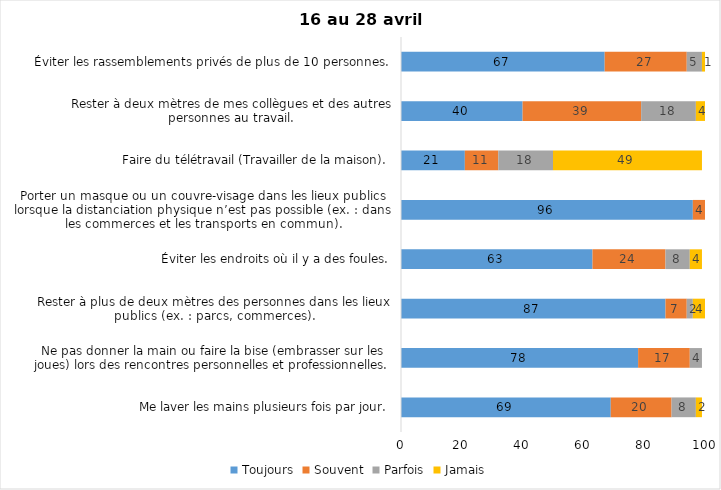
| Category | Toujours | Souvent | Parfois | Jamais |
|---|---|---|---|---|
| Me laver les mains plusieurs fois par jour. | 69 | 20 | 8 | 2 |
| Ne pas donner la main ou faire la bise (embrasser sur les joues) lors des rencontres personnelles et professionnelles. | 78 | 17 | 4 | 0 |
| Rester à plus de deux mètres des personnes dans les lieux publics (ex. : parcs, commerces). | 87 | 7 | 2 | 4 |
| Éviter les endroits où il y a des foules. | 63 | 24 | 8 | 4 |
| Porter un masque ou un couvre-visage dans les lieux publics lorsque la distanciation physique n’est pas possible (ex. : dans les commerces et les transports en commun). | 96 | 4 | 0 | 0 |
| Faire du télétravail (Travailler de la maison). | 21 | 11 | 18 | 49 |
| Rester à deux mètres de mes collègues et des autres personnes au travail. | 40 | 39 | 18 | 4 |
| Éviter les rassemblements privés de plus de 10 personnes. | 67 | 27 | 5 | 1 |